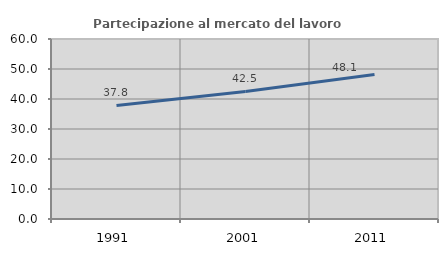
| Category | Partecipazione al mercato del lavoro  femminile |
|---|---|
| 1991.0 | 37.846 |
| 2001.0 | 42.507 |
| 2011.0 | 48.139 |